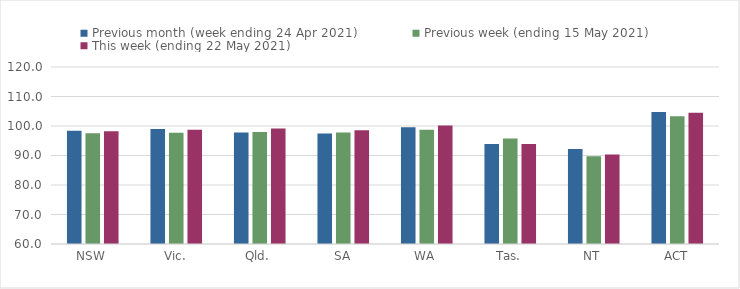
| Category | Previous month (week ending 24 Apr 2021) | Previous week (ending 15 May 2021) | This week (ending 22 May 2021) |
|---|---|---|---|
| NSW | 98.38 | 97.54 | 98.19 |
| Vic. | 98.96 | 97.75 | 98.77 |
| Qld. | 97.82 | 97.98 | 99.12 |
| SA | 97.44 | 97.77 | 98.52 |
| WA | 99.54 | 98.77 | 100.21 |
| Tas. | 93.87 | 95.76 | 93.87 |
| NT | 92.17 | 89.73 | 90.35 |
| ACT | 104.71 | 103.3 | 104.52 |